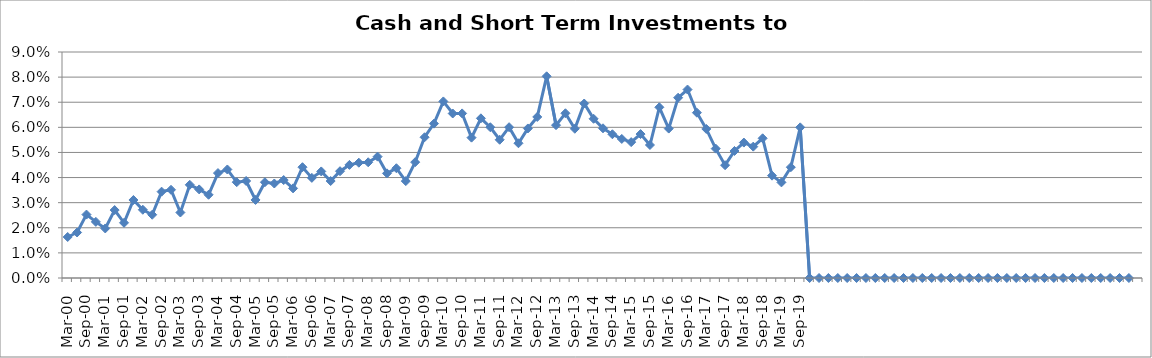
| Category | Cash and Short-Term Investments to Revenue % |
|---|---|
| Mar-00 | 0.016 |
| Jun-00 | 0.018 |
| Sep-00 | 0.025 |
| Dec-00 | 0.022 |
| Mar-01 | 0.02 |
| Jun-01 | 0.027 |
| Sep-01 | 0.022 |
| Dec-01 | 0.031 |
| Mar-02 | 0.027 |
| Jun-02 | 0.025 |
| Sep-02 | 0.034 |
| Dec-02 | 0.035 |
| Mar-03 | 0.026 |
| Jun-03 | 0.037 |
| Sep-03 | 0.035 |
| Dec-03 | 0.033 |
| Mar-04 | 0.042 |
| Jun-04 | 0.043 |
| Sep-04 | 0.038 |
| Dec-04 | 0.039 |
| Mar-05 | 0.031 |
| Jun-05 | 0.038 |
| Sep-05 | 0.038 |
| Dec-05 | 0.039 |
| Mar-06 | 0.036 |
| Jun-06 | 0.044 |
| Sep-06 | 0.04 |
| Dec-06 | 0.042 |
| Mar-07 | 0.039 |
| Jun-07 | 0.043 |
| Sep-07 | 0.045 |
| Dec-07 | 0.046 |
| Mar-08 | 0.046 |
| Jun-08 | 0.048 |
| Sep-08 | 0.042 |
| Dec-08 | 0.044 |
| Mar-09 | 0.039 |
| Jun-09 | 0.046 |
| Sep-09 | 0.056 |
| Dec-09 | 0.061 |
| Mar-10 | 0.07 |
| Jun-10 | 0.066 |
| Sep-10 | 0.066 |
| Dec-10 | 0.056 |
| Mar-11 | 0.064 |
| Jun-11 | 0.06 |
| Sep-11 | 0.055 |
| Dec-11 | 0.06 |
| Mar-12 | 0.054 |
| Jun-12 | 0.06 |
| Sep-12 | 0.064 |
| Dec-12 | 0.08 |
| Mar-13 | 0.061 |
| Jun-13 | 0.066 |
| Sep-13 | 0.059 |
| Dec-13 | 0.069 |
| Mar-14 | 0.063 |
| Jun-14 | 0.06 |
| Sep-14 | 0.057 |
| Dec-14 | 0.055 |
| Mar-15 | 0.054 |
| Jun-15 | 0.057 |
| Sep-15 | 0.053 |
| Dec-15 | 0.068 |
| Mar-16 | 0.059 |
| Jun-16 | 0.072 |
| Sep-16 | 0.075 |
| Dec-16 | 0.066 |
| Mar-17 | 0.059 |
| Jun-17 | 0.052 |
| Sep-17 | 0.045 |
| Dec-17 | 0.051 |
| Mar-18 | 0.054 |
| Jun-18 | 0.052 |
| Sep-18 | 0.056 |
| Dec-18 | 0.041 |
| Mar-19 | 0.038 |
| Jun-19 | 0.044 |
| Sep-19 | 0.06 |